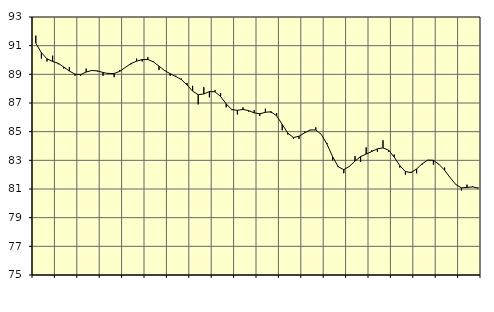
| Category | Piggar | Series 1 |
|---|---|---|
| nan | 91.7 | 91.17 |
| 1.0 | 90.1 | 90.51 |
| 1.0 | 89.9 | 90.08 |
| 1.0 | 90.3 | 89.9 |
| nan | 89.7 | 89.77 |
| 2.0 | 89.4 | 89.51 |
| 2.0 | 89.5 | 89.23 |
| 2.0 | 88.9 | 89.01 |
| nan | 88.9 | 88.98 |
| 3.0 | 89.4 | 89.16 |
| 3.0 | 89.3 | 89.27 |
| 3.0 | 89.2 | 89.24 |
| nan | 88.9 | 89.13 |
| 4.0 | 89.1 | 89.05 |
| 4.0 | 88.8 | 89.06 |
| 4.0 | 89.3 | 89.21 |
| nan | 89.5 | 89.49 |
| 5.0 | 89.7 | 89.75 |
| 5.0 | 90.1 | 89.92 |
| 5.0 | 89.9 | 90.03 |
| nan | 90.2 | 90.04 |
| 6.0 | 89.9 | 89.87 |
| 6.0 | 89.3 | 89.57 |
| 6.0 | 89.3 | 89.27 |
| nan | 88.9 | 89.04 |
| 7.0 | 88.9 | 88.85 |
| 7.0 | 88.7 | 88.63 |
| 7.0 | 88.4 | 88.26 |
| nan | 88.2 | 87.83 |
| 8.0 | 86.9 | 87.58 |
| 8.0 | 88.1 | 87.63 |
| 8.0 | 87.4 | 87.8 |
| nan | 87.9 | 87.78 |
| 9.0 | 87.7 | 87.45 |
| 9.0 | 86.7 | 86.94 |
| 9.0 | 86.5 | 86.54 |
| nan | 86.2 | 86.49 |
| 10.0 | 86.7 | 86.55 |
| 10.0 | 86.4 | 86.47 |
| 10.0 | 86.5 | 86.31 |
| nan | 86.1 | 86.25 |
| 11.0 | 86.6 | 86.35 |
| 11.0 | 86.3 | 86.39 |
| 11.0 | 86.3 | 86.11 |
| nan | 85.1 | 85.51 |
| 12.0 | 84.8 | 84.9 |
| 12.0 | 84.5 | 84.59 |
| 12.0 | 84.5 | 84.68 |
| nan | 85 | 84.92 |
| 13.0 | 85.1 | 85.12 |
| 13.0 | 85.3 | 85.12 |
| 13.0 | 84.8 | 84.8 |
| nan | 84.2 | 84.13 |
| 14.0 | 83 | 83.26 |
| 14.0 | 82.6 | 82.55 |
| 14.0 | 82.1 | 82.35 |
| nan | 82.6 | 82.58 |
| 15.0 | 83.3 | 82.95 |
| 15.0 | 82.9 | 83.26 |
| 15.0 | 83.9 | 83.44 |
| nan | 83.7 | 83.62 |
| 16.0 | 83.6 | 83.8 |
| 16.0 | 84.4 | 83.87 |
| 16.0 | 83.6 | 83.71 |
| nan | 83.4 | 83.23 |
| 17.0 | 82.5 | 82.63 |
| 17.0 | 82 | 82.22 |
| 17.0 | 82.2 | 82.14 |
| nan | 82.1 | 82.4 |
| 18.0 | 82.7 | 82.76 |
| 18.0 | 83 | 83.02 |
| 18.0 | 82.7 | 83 |
| nan | 82.7 | 82.72 |
| 19.0 | 82.5 | 82.31 |
| 19.0 | 81.8 | 81.79 |
| 19.0 | 81.3 | 81.31 |
| nan | 80.9 | 81.08 |
| 20.0 | 81.3 | 81.11 |
| 20.0 | 81.2 | 81.15 |
| 20.0 | 81.1 | 81.06 |